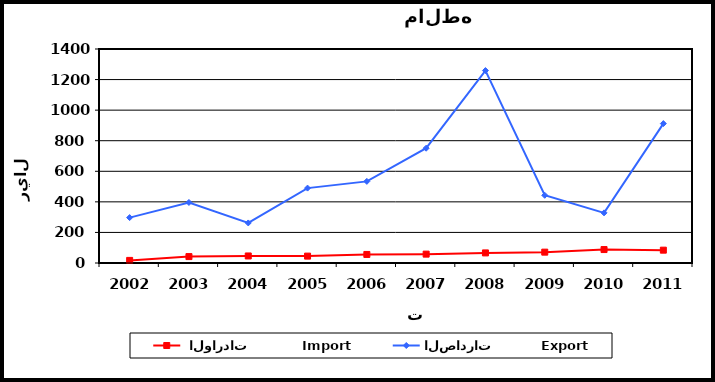
| Category |  الواردات           Import | الصادرات          Export |
|---|---|---|
| 2002.0 | 17 | 297 |
| 2003.0 | 42 | 396 |
| 2004.0 | 46 | 262 |
| 2005.0 | 45 | 490 |
| 2006.0 | 56 | 534 |
| 2007.0 | 58 | 751 |
| 2008.0 | 66 | 1259 |
| 2009.0 | 71 | 443 |
| 2010.0 | 88 | 328 |
| 2011.0 | 84 | 912 |